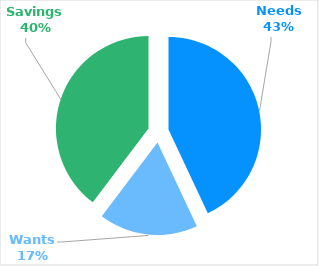
| Category | Series 0 |
|---|---|
| Needs | 1083 |
| Wants | 435 |
| Savings | 1000 |